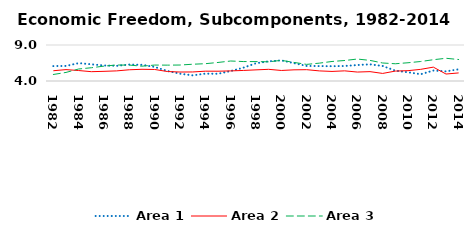
| Category | Area 1 | Area 2 | Area 3 |
|---|---|---|---|
| 1982.0 | 6.074 | 5.425 | 4.906 |
| 1983.0 | 6.091 | 5.581 | 5.19 |
| 1984.0 | 6.485 | 5.454 | 5.667 |
| 1985.0 | 6.321 | 5.294 | 5.841 |
| 1986.0 | 6.155 | 5.343 | 6.067 |
| 1987.0 | 6.107 | 5.405 | 6.223 |
| 1988.0 | 6.281 | 5.559 | 6.209 |
| 1989.0 | 6.249 | 5.627 | 6.061 |
| 1990.0 | 5.958 | 5.6 | 6.214 |
| 1991.0 | 5.394 | 5.317 | 6.204 |
| 1992.0 | 5.014 | 5.246 | 6.219 |
| 1993.0 | 4.784 | 5.255 | 6.328 |
| 1994.0 | 5.021 | 5.363 | 6.404 |
| 1995.0 | 5.001 | 5.36 | 6.574 |
| 1996.0 | 5.388 | 5.404 | 6.777 |
| 1997.0 | 5.844 | 5.466 | 6.701 |
| 1998.0 | 6.465 | 5.545 | 6.694 |
| 1999.0 | 6.733 | 5.623 | 6.663 |
| 2000.0 | 6.862 | 5.462 | 6.87 |
| 2001.0 | 6.477 | 5.55 | 6.579 |
| 2002.0 | 6.092 | 5.572 | 6.308 |
| 2003.0 | 6.074 | 5.403 | 6.48 |
| 2004.0 | 6.055 | 5.329 | 6.711 |
| 2005.0 | 6.082 | 5.409 | 6.847 |
| 2006.0 | 6.216 | 5.242 | 7.051 |
| 2007.0 | 6.316 | 5.3 | 6.862 |
| 2008.0 | 6.082 | 5.051 | 6.501 |
| 2009.0 | 5.441 | 5.376 | 6.395 |
| 2010.0 | 5.209 | 5.435 | 6.534 |
| 2011.0 | 4.941 | 5.618 | 6.706 |
| 2012.0 | 5.454 | 5.927 | 6.956 |
| 2013.0 | 5.337 | 4.967 | 7.157 |
| 2014.0 | 5.623 | 5.124 | 6.983 |